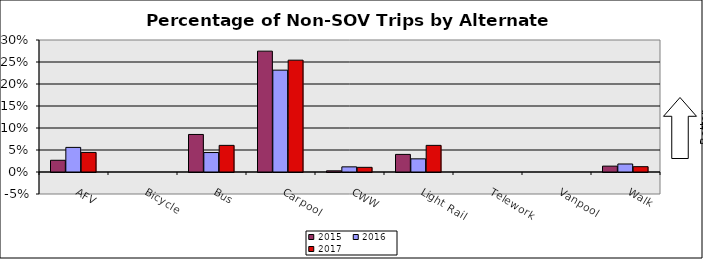
| Category | 2015 | 2016 | 2017 |
|---|---|---|---|
| AFV | 0.027 | 0.056 | 0.044 |
| Bicycle | 0 | 0 | 0 |
| Bus | 0.085 | 0.044 | 0.061 |
| Carpool | 0.275 | 0.231 | 0.254 |
| CWW | 0.003 | 0.012 | 0.011 |
| Light Rail | 0.04 | 0.03 | 0.061 |
| Telework | 0 | 0 | 0 |
| Vanpool | 0 | 0 | 0 |
| Walk | 0.013 | 0.018 | 0.012 |